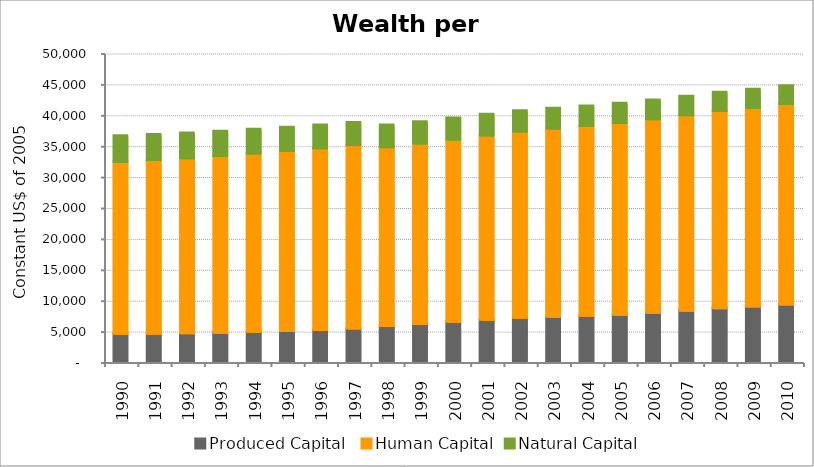
| Category | Produced Capital  | Human Capital | Natural Capital |
|---|---|---|---|
| 1990.0 | 4568.769 | 27819.177 | 4225.133 |
| 1991.0 | 4580.5 | 28087.816 | 4152.387 |
| 1992.0 | 4643.264 | 28328.048 | 4089.883 |
| 1993.0 | 4741.398 | 28575.102 | 4008.109 |
| 1994.0 | 4878.328 | 28845.624 | 3928.802 |
| 1995.0 | 5013.998 | 29125.594 | 3853.947 |
| 1996.0 | 5184.371 | 29388.108 | 3769.103 |
| 1997.0 | 5425.754 | 29670.1 | 3673.852 |
| 1998.0 | 5838.571 | 28910.569 | 3617.732 |
| 1999.0 | 6155.615 | 29197.989 | 3534.427 |
| 2000.0 | 6531.106 | 29475.742 | 3474.336 |
| 2001.0 | 6847.857 | 29819.664 | 3417.813 |
| 2002.0 | 7171.891 | 30133.346 | 3362.552 |
| 2003.0 | 7330.464 | 30435.175 | 3277.521 |
| 2004.0 | 7464.108 | 30735.291 | 3226.657 |
| 2005.0 | 7654.215 | 31032.329 | 3177.443 |
| 2006.0 | 7951.954 | 31319.067 | 3129.614 |
| 2007.0 | 8312.846 | 31615.602 | 3083.287 |
| 2008.0 | 8717.065 | 31892.054 | 3027.412 |
| 2009.0 | 8966.951 | 32165.623 | 2986.651 |
| 2010.0 | 9320.573 | 32421.917 | 2947.399 |